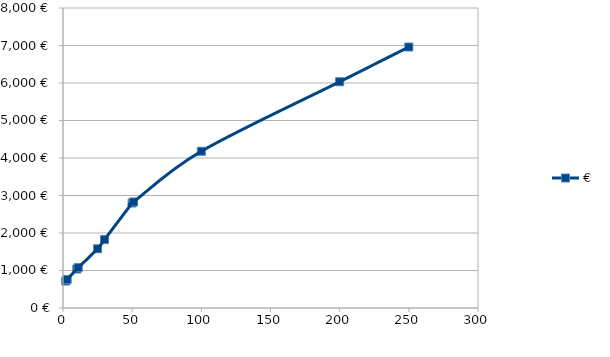
| Category | € |
|---|---|
| 2.0 | 720 |
| 3.0 | 760 |
| 10.0 | 1040 |
| 11.0 | 1076 |
| 25.0 | 1580 |
| 30.0 | 1824 |
| 50.0 | 2800 |
| 51.0 | 2827.6 |
| 100.0 | 4180 |
| 200.0 | 6033.333 |
| 250.0 | 6960 |